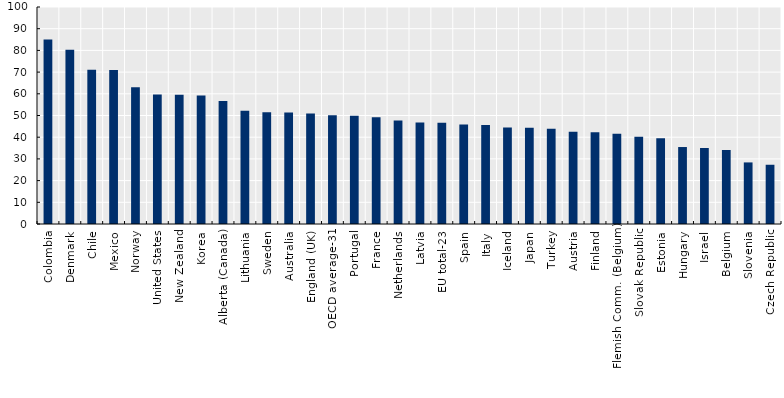
| Category | Have students work in small groups to come up with a joint solution to a problem or task |
|---|---|
| Colombia | 84.992 |
| Denmark | 80.295 |
| Chile | 71.043 |
| Mexico | 70.948 |
| Norway | 63.007 |
| United States | 59.716 |
| New Zealand | 59.536 |
| Korea | 59.227 |
| Alberta (Canada) | 56.736 |
| Lithuania | 52.237 |
| Sweden | 51.451 |
| Australia | 51.344 |
| England (UK) | 50.907 |
| OECD average-31 | 50.13 |
| Portugal | 49.926 |
| France | 49.23 |
| Netherlands | 47.652 |
| Latvia | 46.734 |
| EU total-23 | 46.69 |
| Spain | 45.855 |
| Italy | 45.661 |
| Iceland | 44.499 |
| Japan | 44.407 |
| Turkey | 43.899 |
| Austria | 42.474 |
| Finland | 42.285 |
|     Flemish Comm. (Belgium) | 41.586 |
| Slovak Republic | 40.157 |
| Estonia | 39.526 |
| Hungary | 35.471 |
| Israel | 35.026 |
| Belgium | 34.11 |
| Slovenia | 28.378 |
| Czech Republic | 27.304 |